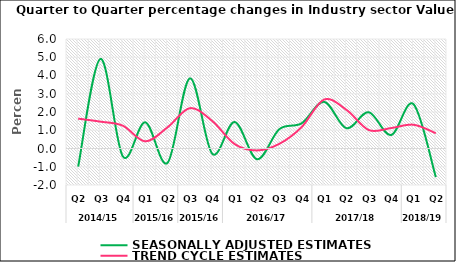
| Category | SEASONALLY ADJUSTED ESTIMATES | TREND CYCLE ESTIMATES |
|---|---|---|
| 0 | -0.991 | 1.636 |
| 1 | 4.91 | 1.471 |
| 2 | -0.436 | 1.248 |
| 3 | 1.435 | 0.392 |
| 4 | -0.784 | 1.164 |
| 5 | 3.845 | 2.209 |
| 6 | -0.291 | 1.503 |
| 7 | 1.451 | 0.242 |
| 8 | -0.588 | -0.106 |
| 9 | 1.059 | 0.256 |
| 10 | 1.383 | 1.176 |
| 11 | 2.554 | 2.681 |
| 12 | 1.112 | 2.12 |
| 13 | 1.989 | 1.012 |
| 14 | 0.738 | 1.12 |
| 15 | 2.432 | 1.303 |
| 16 | -1.565 | 0.836 |